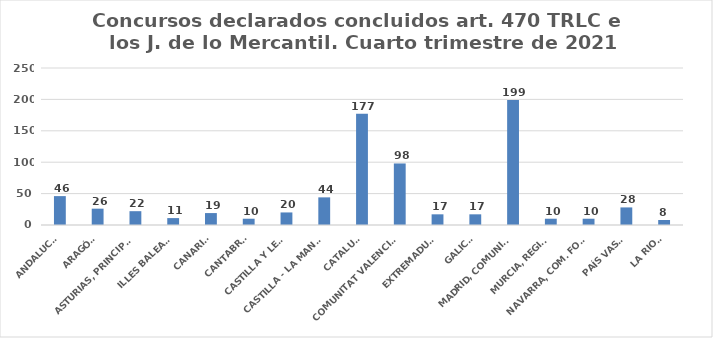
| Category | Series 0 |
|---|---|
| ANDALUCÍA | 46 |
| ARAGÓN | 26 |
| ASTURIAS, PRINCIPADO | 22 |
| ILLES BALEARS | 11 |
| CANARIAS | 19 |
| CANTABRIA | 10 |
| CASTILLA Y LEÓN | 20 |
| CASTILLA - LA MANCHA | 44 |
| CATALUÑA | 177 |
| COMUNITAT VALENCIANA | 98 |
| EXTREMADURA | 17 |
| GALICIA | 17 |
| MADRID, COMUNIDAD | 199 |
| MURCIA, REGIÓN | 10 |
| NAVARRA, COM. FORAL | 10 |
| PAÍS VASCO | 28 |
| LA RIOJA | 8 |